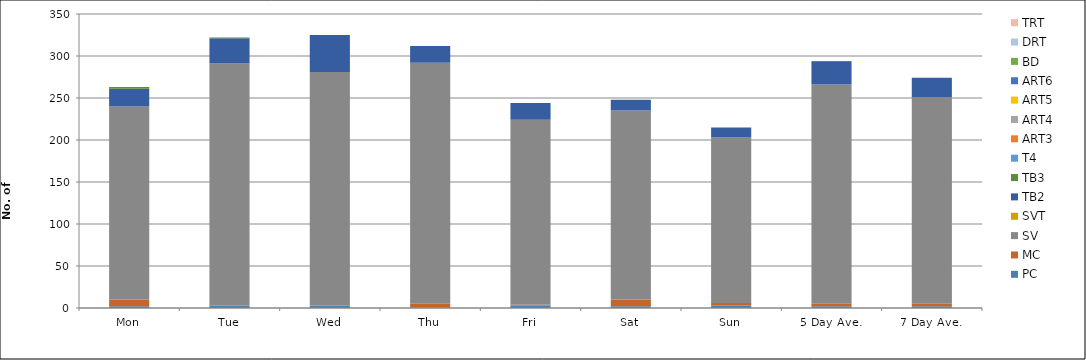
| Category | PC | MC | SV | SVT | TB2 | TB3 | T4 | ART3 | ART4 | ART5 | ART6 | BD | DRT | TRT |
|---|---|---|---|---|---|---|---|---|---|---|---|---|---|---|
| Mon | 2 | 8 | 230 | 0 | 21 | 2 | 0 | 0 | 0 | 0 | 0 | 0 | 0 | 0 |
| Tue | 3 | 0 | 288 | 0 | 30 | 1 | 0 | 0 | 0 | 0 | 0 | 0 | 0 | 0 |
| Wed | 3 | 0 | 278 | 0 | 44 | 0 | 0 | 0 | 0 | 0 | 0 | 0 | 0 | 0 |
| Thu | 1 | 4 | 287 | 0 | 20 | 0 | 0 | 0 | 0 | 0 | 0 | 0 | 0 | 0 |
| Fri | 3 | 1 | 220 | 0 | 20 | 0 | 0 | 0 | 0 | 0 | 0 | 0 | 0 | 0 |
| Sat | 2 | 8 | 225 | 0 | 13 | 0 | 0 | 0 | 0 | 0 | 0 | 0 | 0 | 0 |
| Sun | 3 | 3 | 197 | 0 | 12 | 0 | 0 | 0 | 0 | 0 | 0 | 0 | 0 | 0 |
| 5 Day Ave. | 2 | 3 | 261 | 0 | 27 | 1 | 0 | 0 | 0 | 0 | 0 | 0 | 0 | 0 |
| 7 Day Ave. | 2 | 3 | 246 | 0 | 23 | 0 | 0 | 0 | 0 | 0 | 0 | 0 | 0 | 0 |